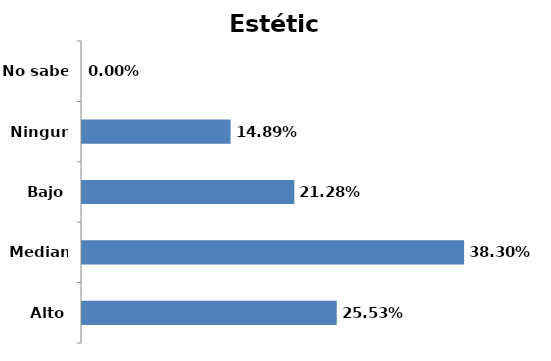
| Category | Series 0 |
|---|---|
| Alto | 0.255 |
| Mediano | 0.383 |
| Bajo | 0.213 |
| Ninguno | 0.149 |
| No sabe | 0 |